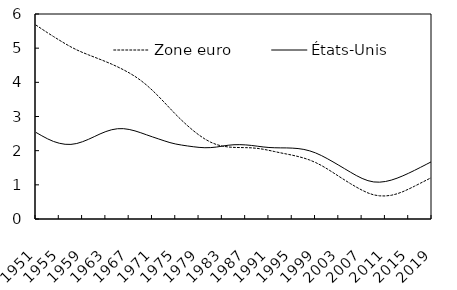
| Category | Zone euro | États-Unis |
|---|---|---|
| 1951.0 | 5.675 | 2.533 |
| 1952.0 | 5.561 | 2.436 |
| 1953.0 | 5.449 | 2.346 |
| 1954.0 | 5.341 | 2.27 |
| 1955.0 | 5.235 | 2.217 |
| 1956.0 | 5.132 | 2.187 |
| 1957.0 | 5.036 | 2.184 |
| 1958.0 | 4.949 | 2.21 |
| 1959.0 | 4.874 | 2.263 |
| 1960.0 | 4.805 | 2.331 |
| 1961.0 | 4.739 | 2.41 |
| 1962.0 | 4.672 | 2.49 |
| 1963.0 | 4.604 | 2.56 |
| 1964.0 | 4.532 | 2.613 |
| 1965.0 | 4.454 | 2.642 |
| 1966.0 | 4.37 | 2.644 |
| 1967.0 | 4.277 | 2.621 |
| 1968.0 | 4.174 | 2.579 |
| 1969.0 | 4.055 | 2.524 |
| 1970.0 | 3.918 | 2.463 |
| 1971.0 | 3.764 | 2.404 |
| 1972.0 | 3.597 | 2.346 |
| 1973.0 | 3.42 | 2.289 |
| 1974.0 | 3.238 | 2.236 |
| 1975.0 | 3.059 | 2.194 |
| 1976.0 | 2.892 | 2.164 |
| 1977.0 | 2.733 | 2.138 |
| 1978.0 | 2.587 | 2.116 |
| 1979.0 | 2.456 | 2.096 |
| 1980.0 | 2.341 | 2.086 |
| 1981.0 | 2.247 | 2.09 |
| 1982.0 | 2.178 | 2.106 |
| 1983.0 | 2.133 | 2.133 |
| 1984.0 | 2.108 | 2.159 |
| 1985.0 | 2.096 | 2.173 |
| 1986.0 | 2.091 | 2.176 |
| 1987.0 | 2.089 | 2.169 |
| 1988.0 | 2.083 | 2.153 |
| 1989.0 | 2.068 | 2.132 |
| 1990.0 | 2.042 | 2.11 |
| 1991.0 | 2.009 | 2.093 |
| 1992.0 | 1.972 | 2.085 |
| 1993.0 | 1.936 | 2.082 |
| 1994.0 | 1.903 | 2.08 |
| 1995.0 | 1.868 | 2.075 |
| 1996.0 | 1.83 | 2.062 |
| 1997.0 | 1.783 | 2.036 |
| 1998.0 | 1.726 | 1.994 |
| 1999.0 | 1.654 | 1.934 |
| 2000.0 | 1.568 | 1.858 |
| 2001.0 | 1.468 | 1.768 |
| 2002.0 | 1.36 | 1.672 |
| 2003.0 | 1.25 | 1.573 |
| 2004.0 | 1.141 | 1.472 |
| 2005.0 | 1.035 | 1.37 |
| 2006.0 | 0.934 | 1.273 |
| 2007.0 | 0.842 | 1.188 |
| 2008.0 | 0.763 | 1.122 |
| 2009.0 | 0.706 | 1.085 |
| 2010.0 | 0.677 | 1.078 |
| 2011.0 | 0.674 | 1.097 |
| 2012.0 | 0.694 | 1.138 |
| 2013.0 | 0.737 | 1.195 |
| 2014.0 | 0.8 | 1.264 |
| 2015.0 | 0.876 | 1.341 |
| 2016.0 | 0.96 | 1.423 |
| 2017.0 | 1.047 | 1.509 |
| 2018.0 | 1.134 | 1.597 |
| 2019.0 | 1.22 | 1.685 |